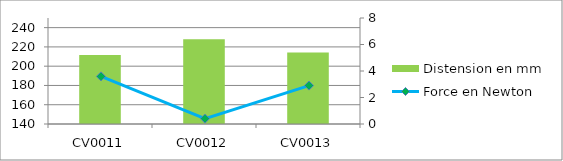
| Category | Distension en mm |
|---|---|
| CV0011 | 5.2 |
| CV0012 | 6.4 |
| CV0013 | 5.4 |